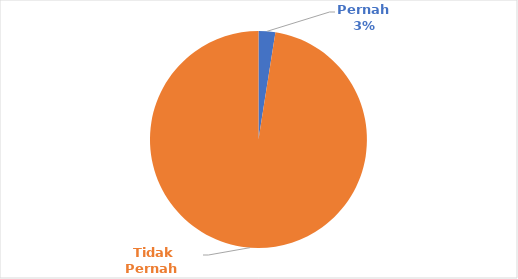
| Category | Series 1 |
|---|---|
| Pernah  | 1 |
| Tidak Pernah  | 39 |